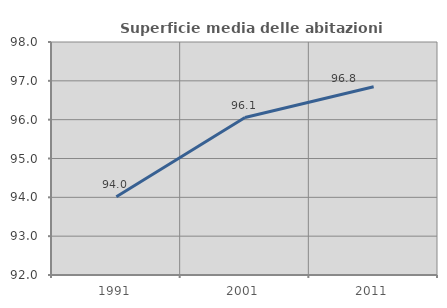
| Category | Superficie media delle abitazioni occupate |
|---|---|
| 1991.0 | 94.016 |
| 2001.0 | 96.054 |
| 2011.0 | 96.847 |